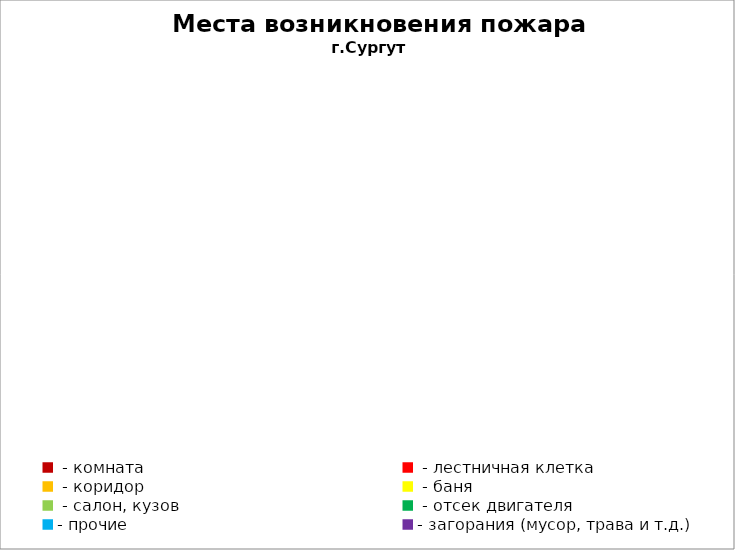
| Category | Места возникновения пожара |
|---|---|
|  - комната | 50 |
|  - лестничная клетка | 25 |
|  - коридор | 9 |
|  - баня | 28 |
|  - салон, кузов | 10 |
|  - отсек двигателя | 31 |
| - прочие | 123 |
| - загорания (мусор, трава и т.д.)  | 162 |